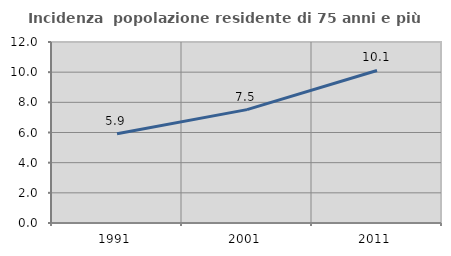
| Category | Incidenza  popolazione residente di 75 anni e più |
|---|---|
| 1991.0 | 5.912 |
| 2001.0 | 7.516 |
| 2011.0 | 10.113 |